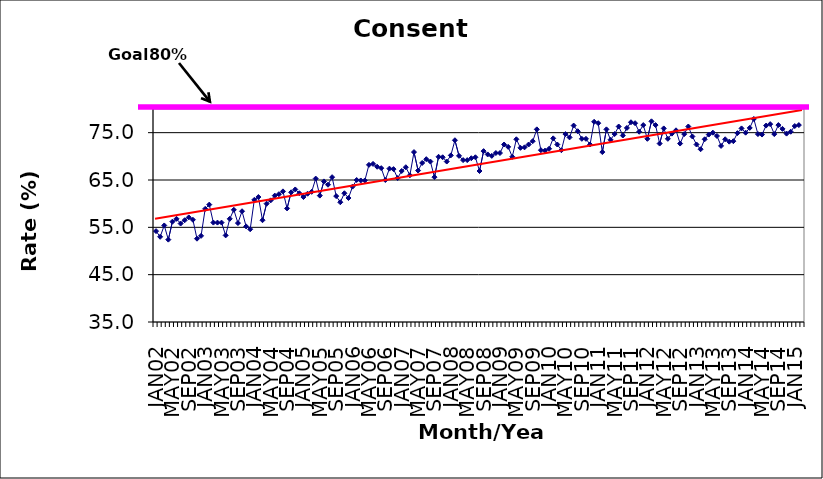
| Category | Series 0 |
|---|---|
| JAN02 | 54.2 |
| FEB02 | 53 |
| MAR02 | 55.4 |
| APR02 | 52.4 |
| MAY02 | 56.2 |
| JUN02 | 56.8 |
| JUL02 | 55.8 |
| AUG02 | 56.5 |
| SEP02 | 57.1 |
| OCT02 | 56.6 |
| NOV02 | 52.6 |
| DEC02 | 53.2 |
| JAN03 | 58.9 |
| FEB03 | 59.8 |
| MAR03 | 56 |
| APR03 | 56 |
| MAY03 | 56 |
| JUN03 | 53.3 |
| JUL03 | 56.8 |
| AUG03 | 58.7 |
| SEP03 | 55.9 |
| OCT03 | 58.4 |
| NOV03 | 55.2 |
| DEC03 | 54.6 |
| JAN04 | 60.8 |
| FEB04 | 61.4 |
| MAR04 | 56.5 |
| APR04 | 60 |
| MAY04 | 60.7 |
| JUN04 | 61.7 |
| JUL04 | 62 |
| AUG04 | 62.6 |
| SEP04 | 59 |
| OCT04 | 62.4 |
| NOV04 | 63 |
| DEC04 | 62.2 |
| JAN05 | 61.4 |
| FEB05 | 62.1 |
| MAR05 | 62.5 |
| APR05 | 65.3 |
| MAY05 | 61.7 |
| JUN05 | 64.7 |
| JUL05 | 64 |
| AUG05 | 65.6 |
| SEP05 | 61.6 |
| OCT05 | 60.3 |
| NOV05 | 62.2 |
| DEC05 | 61.2 |
| JAN06 | 63.6 |
| FEB06 | 65 |
| MAR06 | 64.9 |
| APR06 | 64.9 |
| MAY06 | 68.2 |
| JUN06 | 68.4 |
| JUL06 | 67.8 |
| AUG06 | 67.5 |
| SEP06 | 65 |
| OCT06 | 67.4 |
| NOV06 | 67.3 |
| DEC06 | 65.4 |
| JAN07 | 66.9 |
| FEB07 | 67.7 |
| MAR07 | 66 |
| APR07 | 70.9 |
| MAY07 | 67 |
| JUN07 | 68.6 |
| JUL07 | 69.4 |
| AUG07 | 68.9 |
| SEP07 | 65.6 |
| OCT07 | 69.9 |
| NOV07 | 69.8 |
| DEC07 | 68.9 |
| JAN08 | 70.2 |
| FEB08 | 73.4 |
| MAR08 | 70.1 |
| APR08 | 69.2 |
| MAY08 | 69.2 |
| JUN08 | 69.6 |
| JUL08 | 69.8 |
| AUG08 | 66.9 |
| SEP08 | 71.1 |
| OCT08 | 70.4 |
| NOV08 | 70.1 |
| DEC08 | 70.7 |
| JAN09 | 70.7 |
| FEB09 | 72.5 |
| MAR09 | 72 |
| APR09 | 69.9 |
| MAY09 | 73.6 |
| JUN09 | 71.8 |
| JUL09 | 71.9 |
| AUG09 | 72.5 |
| SEP09 | 73.2 |
| OCT09 | 75.7 |
| NOV09 | 71.3 |
| DEC09 | 71.2 |
| JAN10 | 71.6 |
| FEB10 | 73.8 |
| MAR10 | 72.5 |
| APR10 | 71.3 |
| MAY10 | 74.7 |
| JUN10 | 74 |
| JUL10 | 76.5 |
| AUG10 | 75.3 |
| SEP10 | 73.7 |
| OCT10 | 73.7 |
| NOV10 | 72.5 |
| DEC10 | 77.3 |
| JAN11 | 77 |
| FEB11 | 70.9 |
| MAR11 | 75.7 |
| APR11 | 73.5 |
| MAY11 | 74.7 |
| JUN11 | 76.3 |
| JUL11 | 74.4 |
| AUG11 | 76 |
| SEP11 | 77.2 |
| OCT11 | 77 |
| NOV11 | 75.2 |
| DEC11 | 76.6 |
| JAN12 | 73.7 |
| FEB12 | 77.4 |
| MAR12 | 76.6 |
| APR12 | 72.7 |
| MAY12 | 75.9 |
| JUN12 | 73.7 |
| JUL12 | 74.8 |
| AUG12 | 75.5 |
| SEP12 | 72.7 |
| OCT12 | 74.7 |
| NOV12 | 76.3 |
| DEC12 | 74.2 |
| JAN13 | 72.5 |
| FEB13 | 71.5 |
| MAR13 | 73.6 |
| APR13 | 74.6 |
| MAY13 | 75 |
| JUN13 | 74.3 |
| JUL13 | 72.2 |
| AUG13 | 73.6 |
| SEP13 | 73.1 |
| OCT13 | 73.2 |
| NOV13 | 74.9 |
| DEC13 | 75.9 |
| JAN14 | 75 |
| FEB14 | 76 |
| MAR14 | 77.9 |
| APR14 | 74.7 |
| MAY14 | 74.6 |
| JUN14 | 76.5 |
| JUL14 | 76.8 |
| AUG14 | 74.7 |
| SEP14 | 76.6 |
| OCT14 | 75.8 |
| NOV14 | 74.8 |
| DEC14 | 75.2 |
| JAN15 | 76.4 |
| FEB15 | 76.6 |